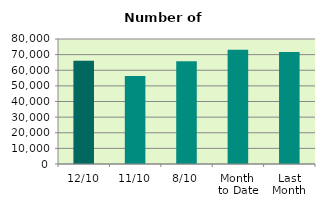
| Category | Series 0 |
|---|---|
| 12/10 | 66034 |
| 11/10 | 56264 |
| 8/10 | 65772 |
| Month 
to Date | 73110.25 |
| Last
Month | 71692 |